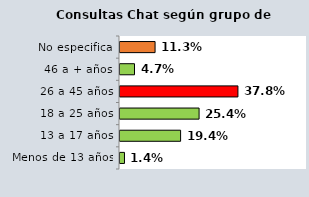
| Category | Series 0 |
|---|---|
| Menos de 13 años | 0.014 |
| 13 a 17 años | 0.194 |
| 18 a 25 años | 0.254 |
| 26 a 45 años | 0.378 |
| 46 a + años | 0.047 |
| No especifica | 0.113 |